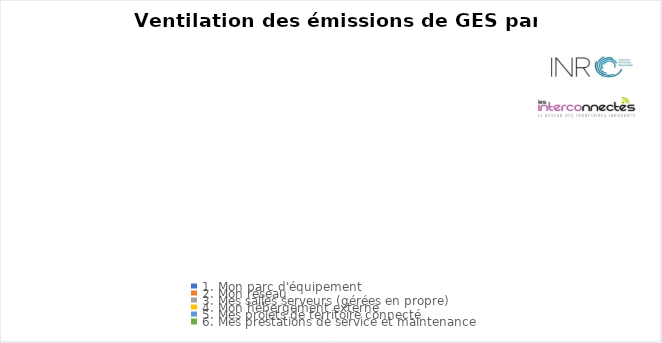
| Category | Series 0 |
|---|---|
| 1. Mon parc d'équipement | 0 |
| 2. Mon réseau | 0 |
| 3. Mes salles serveurs (gérées en propre) | 0 |
| 4. Mon hébergement externe | 0 |
| 5. Mes projets de territoire connecté | 0 |
| 6. Mes prestations de service et maintenance | 0 |